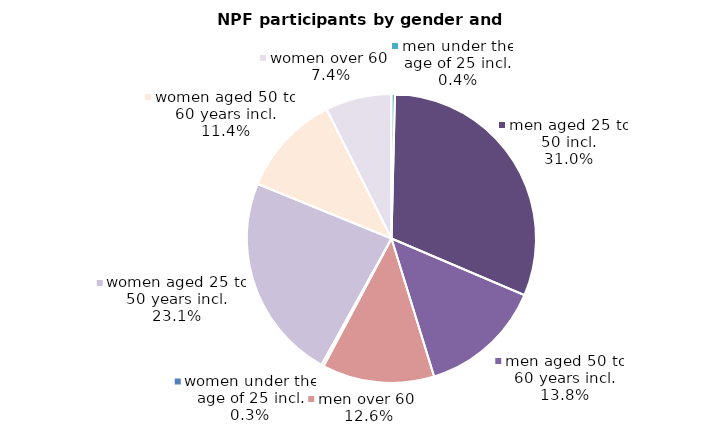
| Category | Series 0 |
|---|---|
| women under the age of 25 incl. | 2382 |
| women aged 25 to 50 years incl. | 202343 |
| women aged 50 to 60 years incl. | 100126 |
| women over 60  | 64760 |
| men under the age of 25 incl. | 3448 |
| men aged 25 to 50 incl. | 271640 |
| men aged 50 to 60 years incl. | 121059 |
| men over 60  | 109843 |